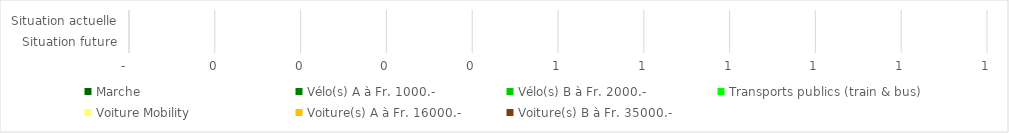
| Category | Marche | Vélo(s) A à Fr. 1000.- | Vélo(s) B à Fr. 2000.- | Transports publics (train & bus) | Voiture Mobility | Voiture(s) A à Fr. 16000.- | Voiture(s) B à Fr. 35000.- |
|---|---|---|---|---|---|---|---|
| Situation future | 0 | 0 | 0 | 0 | 0 | 0 | 0 |
| Situation actuelle | 0 | 0 | 0 | 0 | 0 | 0 | 0 |